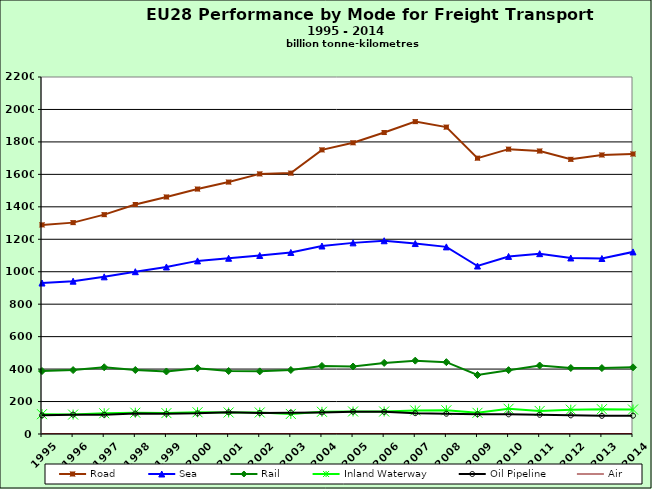
| Category | Road | Sea | Rail | Inland Waterway | Oil Pipeline | Air |
|---|---|---|---|---|---|---|
| 1995.0 | 1288.66 | 930.375 | 388.118 | 122.118 | 114.91 | 1.766 |
| 1996.0 | 1302.579 | 941.74 | 393.863 | 119.778 | 119.33 | 1.819 |
| 1997.0 | 1351.678 | 968.531 | 411.252 | 127.87 | 118.904 | 1.925 |
| 1998.0 | 1414.204 | 1000.193 | 394.338 | 131.064 | 126.34 | 1.987 |
| 1999.0 | 1460.622 | 1029.42 | 385.31 | 128.779 | 124.851 | 2.031 |
| 2000.0 | 1509.488 | 1066.765 | 405.464 | 133.925 | 127.107 | 2.164 |
| 2001.0 | 1552.517 | 1083.001 | 388.048 | 132.606 | 133.937 | 2.173 |
| 2002.0 | 1602.835 | 1100.05 | 385.983 | 132.594 | 129.732 | 2.12 |
| 2003.0 | 1607.683 | 1118.723 | 394.375 | 123.615 | 131.688 | 2.137 |
| 2004.0 | 1750.92 | 1158.503 | 419.326 | 136.913 | 133.259 | 2.217 |
| 2005.0 | 1794.595 | 1177.815 | 416.024 | 138.781 | 137.589 | 2.279 |
| 2006.0 | 1857.747 | 1190.829 | 438.165 | 138.577 | 136.566 | 2.349 |
| 2007.0 | 1924.958 | 1173.586 | 452 | 145.073 | 128.451 | 2.429 |
| 2008.0 | 1891.126 | 1153.122 | 442.763 | 146.129 | 124.945 | 2.385 |
| 2009.0 | 1699.757 | 1035.193 | 363.541 | 130.532 | 121.819 | 2.227 |
| 2010.0 | 1755.311 | 1094.304 | 393.531 | 155.521 | 121.133 | 2.313 |
| 2011.0 | 1743.854 | 1111.285 | 422.097 | 141.969 | 118.37 | 2.283 |
| 2012.0 | 1692.581 | 1084.757 | 406.671 | 149.987 | 114.897 | 2.265 |
| 2013.0 | 1719.448 | 1081.503 | 406.297 | 152.749 | 111.81 | 2.243 |
| 2014.0 | 1725.49 | 1122.125 | 410.794 | 150.876 | 112.888 | 2.243 |